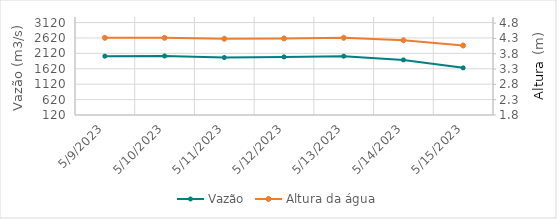
| Category | Vazão |
|---|---|
| 5/11/23 | 1989.29 |
| 5/10/23 | 2025.65 |
| 5/9/23 | 2028.7 |
| 5/8/23 | 1903.33 |
| 5/7/23 | 1668.28 |
| 5/6/23 | 1382.92 |
| 5/5/23 | 1313.48 |